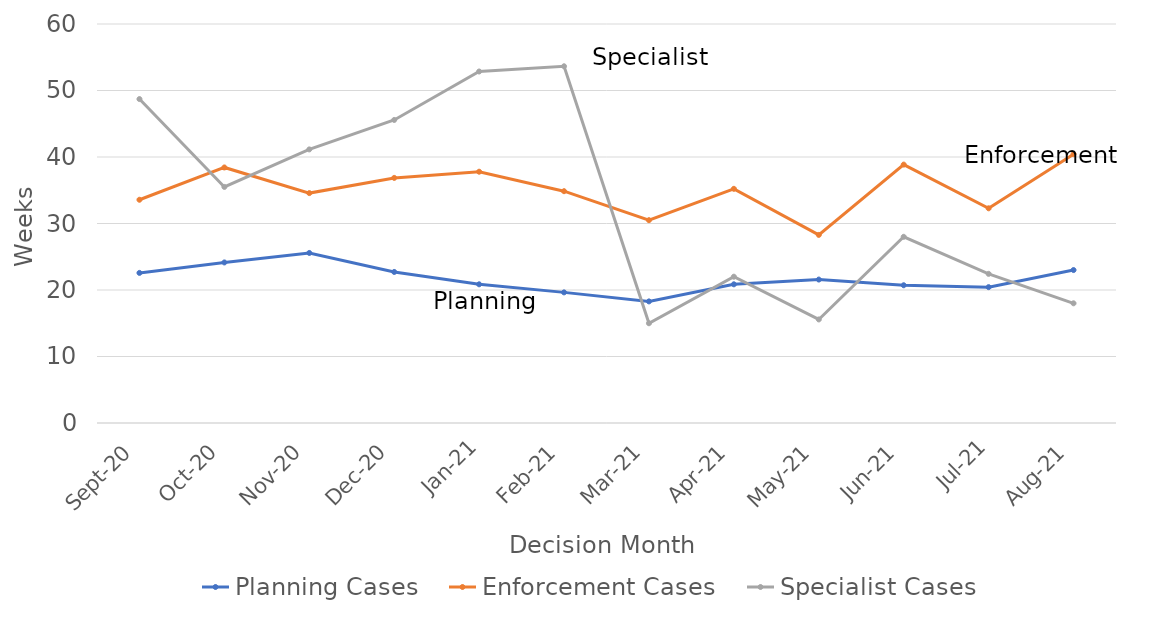
| Category | Planning Cases | Enforcement Cases | Specialist Cases |
|---|---|---|---|
| 2020-09-01 | 22.571 | 33.571 | 48.714 |
| 2020-10-01 | 24.143 | 38.429 | 35.5 |
| 2020-11-01 | 25.571 | 34.571 | 41.143 |
| 2020-12-01 | 22.714 | 36.857 | 45.571 |
| 2021-01-01 | 20.857 | 37.786 | 52.857 |
| 2021-02-01 | 19.643 | 34.857 | 53.643 |
| 2021-03-01 | 18.286 | 30.5 | 15 |
| 2021-04-01 | 20.857 | 35.214 | 22 |
| 2021-05-01 | 21.571 | 28.286 | 15.571 |
| 2021-06-01 | 20.714 | 38.857 | 28 |
| 2021-07-01 | 20.429 | 32.286 | 22.429 |
| 2021-08-01 | 23 | 40.429 | 18 |